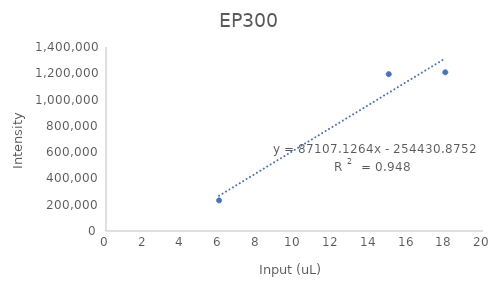
| Category | Series 0 |
|---|---|
| 6.0 | 232890.031 |
| 15.0 | 1193463.429 |
| 18.0 | 1207531.844 |